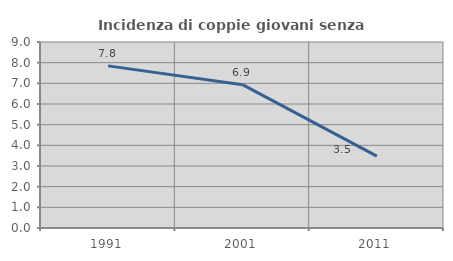
| Category | Incidenza di coppie giovani senza figli |
|---|---|
| 1991.0 | 7.845 |
| 2001.0 | 6.936 |
| 2011.0 | 3.48 |